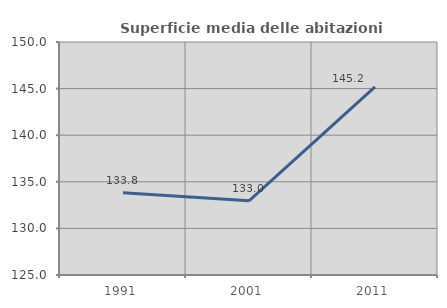
| Category | Superficie media delle abitazioni occupate |
|---|---|
| 1991.0 | 133.837 |
| 2001.0 | 132.961 |
| 2011.0 | 145.177 |